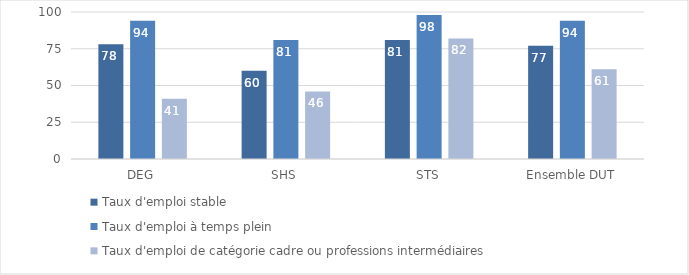
| Category | Taux d'emploi stable | Taux d'emploi à temps plein | Taux d'emploi de catégorie cadre ou professions intermédiaires |
|---|---|---|---|
| DEG | 78 | 94 | 41 |
| SHS | 60 | 81 | 46 |
| STS | 81 | 98 | 82 |
| Ensemble DUT | 77 | 94 | 61 |